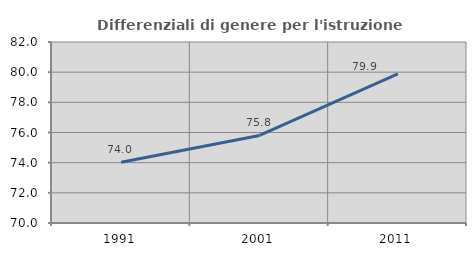
| Category | Differenziali di genere per l'istruzione superiore |
|---|---|
| 1991.0 | 74.026 |
| 2001.0 | 75.807 |
| 2011.0 | 79.89 |